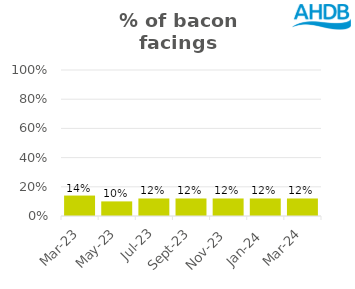
| Category | Bacon |
|---|---|
| 2023-03-01 | 0.14 |
| 2023-05-01 | 0.1 |
| 2023-07-01 | 0.12 |
| 2023-09-01 | 0.12 |
| 2023-11-01 | 0.12 |
| 2024-01-01 | 0.12 |
| 2024-03-01 | 0.12 |